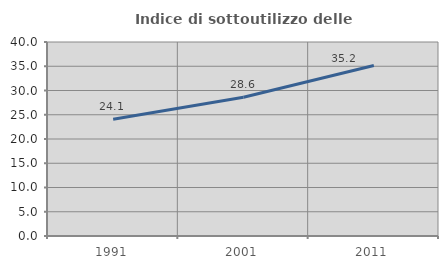
| Category | Indice di sottoutilizzo delle abitazioni  |
|---|---|
| 1991.0 | 24.092 |
| 2001.0 | 28.609 |
| 2011.0 | 35.165 |